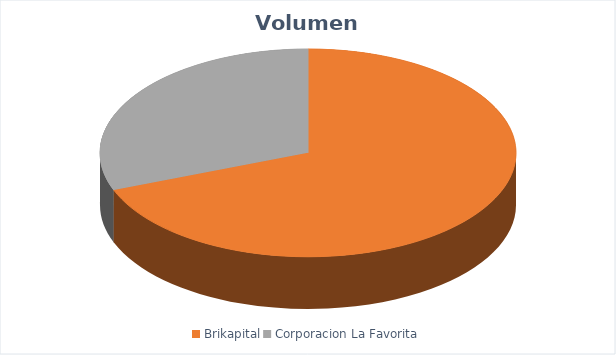
| Category | VOLUMEN ($USD) |
|---|---|
| Brikapital | 177000 |
| Corporacion La Favorita | 78921.02 |